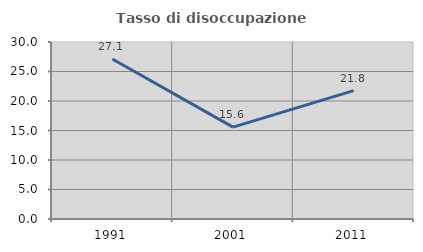
| Category | Tasso di disoccupazione giovanile  |
|---|---|
| 1991.0 | 27.113 |
| 2001.0 | 15.569 |
| 2011.0 | 21.769 |